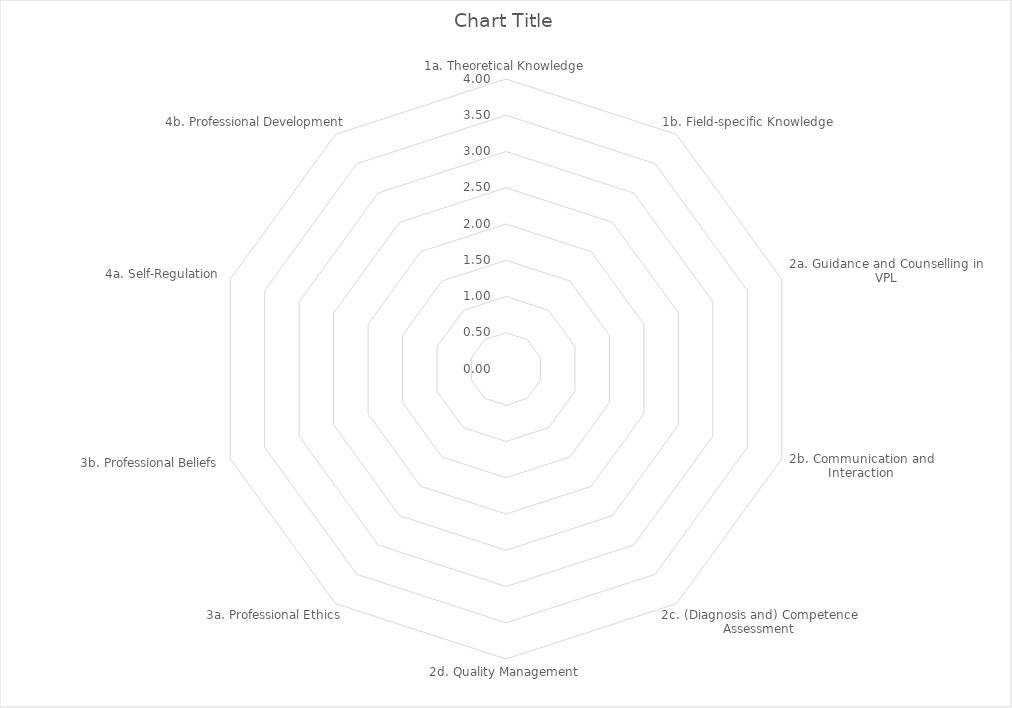
| Category | Series 0 |
|---|---|
| 1a. Theoretical Knowledge | 0 |
| 1b. Field-specific Knowledge | 0 |
| 2a. Guidance and Counselling in VPL | 0 |
| 2b. Communication and Interaction | 0 |
| 2c. (Diagnosis and) Competence Assessment | 0 |
| 2d. Quality Management | 0 |
| 3a. Professional Ethics | 0 |
| 3b. Professional Beliefs | 0 |
| 4a. Self-Regulation | 0 |
| 4b. Professional Development | 0 |